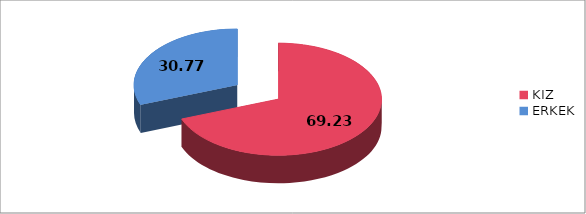
| Category | Series 0 |
|---|---|
| KIZ | 69.23 |
| ERKEK | 30.77 |